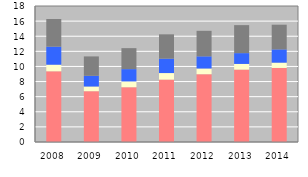
| Category | EU | CEFTА | Russia | Other |
|---|---|---|---|---|
| 2008.0 | 9359.095 | 873.217 | 2389.166 | 3661.546 |
| 2009.0 | 6724.038 | 622.074 | 1414.393 | 2566.53 |
| 2010.0 | 7249.853 | 766.721 | 1629.7 | 2777.18 |
| 2011.0 | 8257.482 | 867.659 | 1906.046 | 3218.858 |
| 2012.0 | 8974.142 | 755.485 | 1607.806 | 3379.31 |
| 2013.0 | 9581.254 | 752.294 | 1429.156 | 3706.319 |
| 2014.0 | 9802.463 | 699.218 | 1756.726 | 3267.878 |